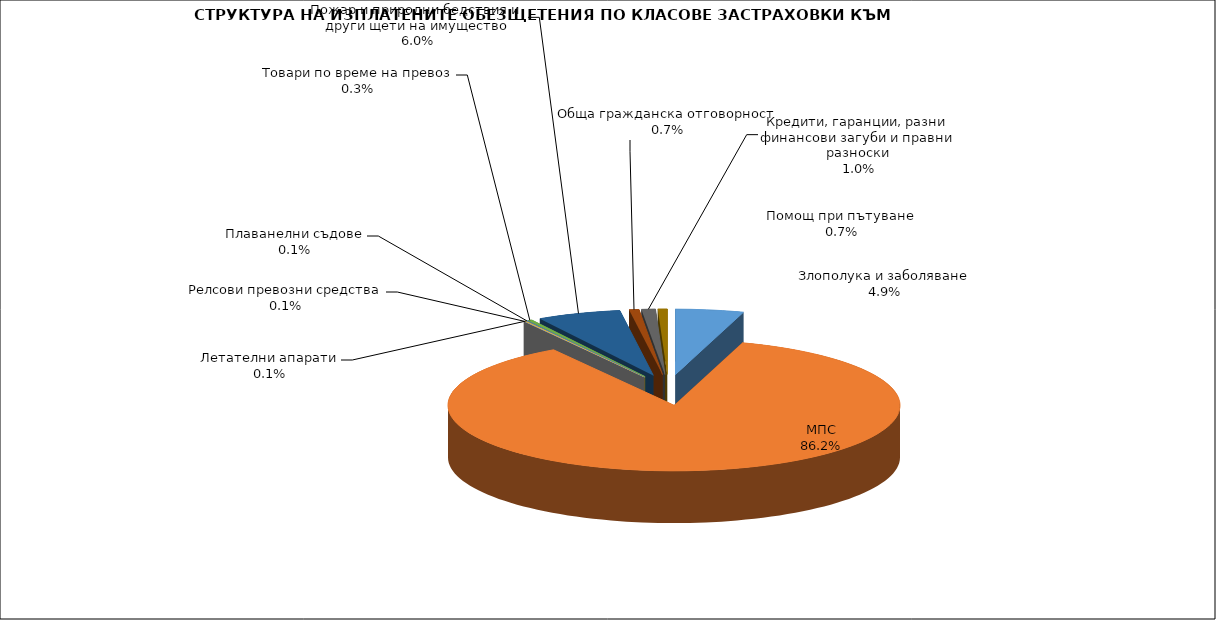
| Category | Series 0 |
|---|---|
| Злополука и заболяване | 0.049 |
| МПС | 0.862 |
| Релсови превозни средства | 0.001 |
| Летателни апарати | 0.001 |
| Плаванелни съдове | 0.001 |
| Товари по време на превоз | 0.003 |
| Пожар и природни бедствия и други щети на имущество | 0.06 |
| Обща гражданска отговорност | 0.007 |
| Кредити, гаранции, разни финансови загуби и правни разноски | 0.01 |
| Помощ при пътуване | 0.007 |